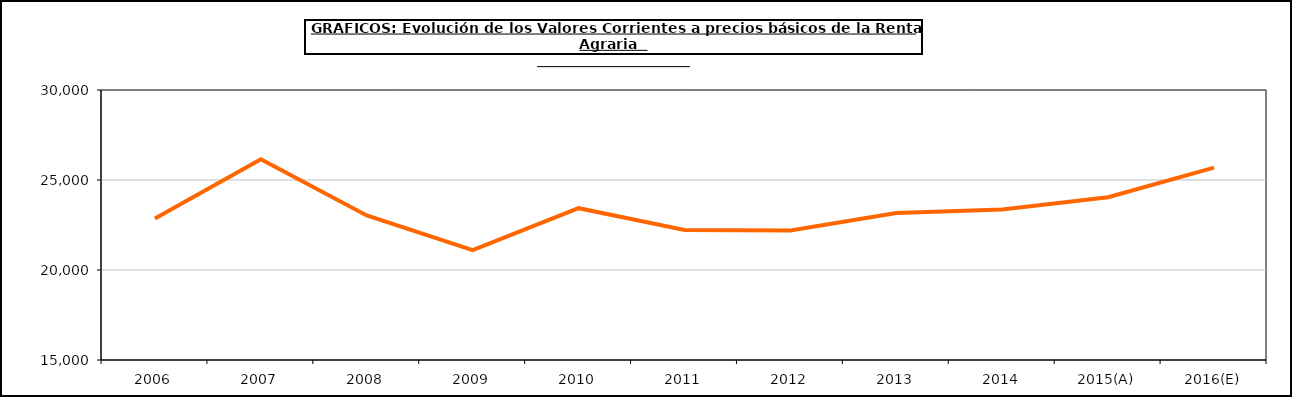
| Category | renta agraria |
|---|---|
| 2006 | 22863.5 |
| 2007 | 26149.9 |
| 2008 | 23031.6 |
| 2009 | 21101 |
| 2010 | 23433.2 |
| 2011 | 22219.2 |
| 2012 | 22193.5 |
| 2013 | 23161.5 |
| 2014 | 23361.1 |
| 2015(A) | 24040.1 |
| 2016(E) | 25687.7 |